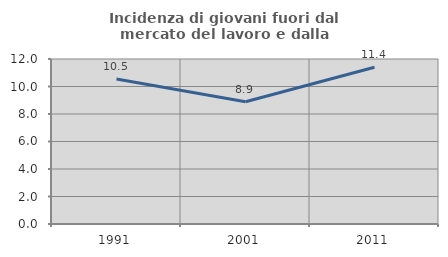
| Category | Incidenza di giovani fuori dal mercato del lavoro e dalla formazione  |
|---|---|
| 1991.0 | 10.542 |
| 2001.0 | 8.889 |
| 2011.0 | 11.404 |